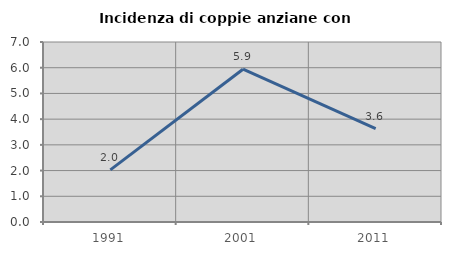
| Category | Incidenza di coppie anziane con figli |
|---|---|
| 1991.0 | 2.025 |
| 2001.0 | 5.941 |
| 2011.0 | 3.627 |